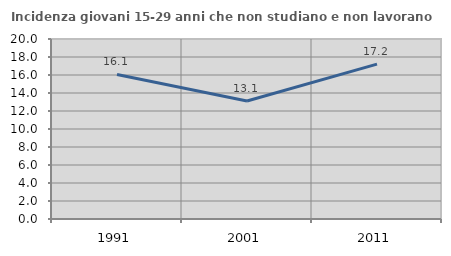
| Category | Incidenza giovani 15-29 anni che non studiano e non lavorano  |
|---|---|
| 1991.0 | 16.063 |
| 2001.0 | 13.115 |
| 2011.0 | 17.213 |